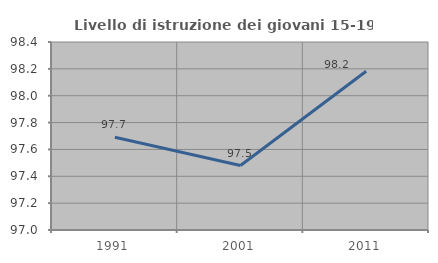
| Category | Livello di istruzione dei giovani 15-19 anni |
|---|---|
| 1991.0 | 97.69 |
| 2001.0 | 97.48 |
| 2011.0 | 98.182 |